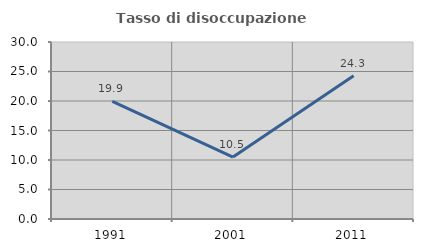
| Category | Tasso di disoccupazione giovanile  |
|---|---|
| 1991.0 | 19.947 |
| 2001.0 | 10.49 |
| 2011.0 | 24.265 |